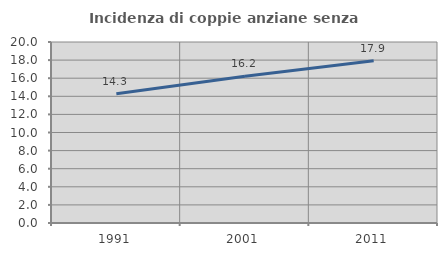
| Category | Incidenza di coppie anziane senza figli  |
|---|---|
| 1991.0 | 14.291 |
| 2001.0 | 16.205 |
| 2011.0 | 17.93 |